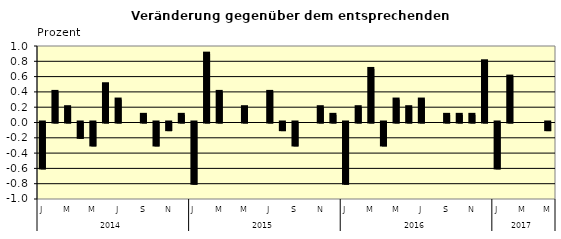
| Category | Series 0 |
|---|---|
| 0 | -0.6 |
| 1 | 0.4 |
| 2 | 0.2 |
| 3 | -0.2 |
| 4 | -0.3 |
| 5 | 0.5 |
| 6 | 0.3 |
| 7 | 0 |
| 8 | 0.1 |
| 9 | -0.3 |
| 10 | -0.1 |
| 11 | 0.1 |
| 12 | -0.8 |
| 13 | 0.9 |
| 14 | 0.4 |
| 15 | 0 |
| 16 | 0.2 |
| 17 | 0 |
| 18 | 0.4 |
| 19 | -0.1 |
| 20 | -0.3 |
| 21 | 0 |
| 22 | 0.2 |
| 23 | 0.1 |
| 24 | -0.8 |
| 25 | 0.2 |
| 26 | 0.7 |
| 27 | -0.3 |
| 28 | 0.3 |
| 29 | 0.2 |
| 30 | 0.3 |
| 31 | 0 |
| 32 | 0.1 |
| 33 | 0.1 |
| 34 | 0.1 |
| 35 | 0.8 |
| 36 | -0.6 |
| 37 | 0.6 |
| 38 | 0 |
| 39 | 0 |
| 40 | -0.1 |